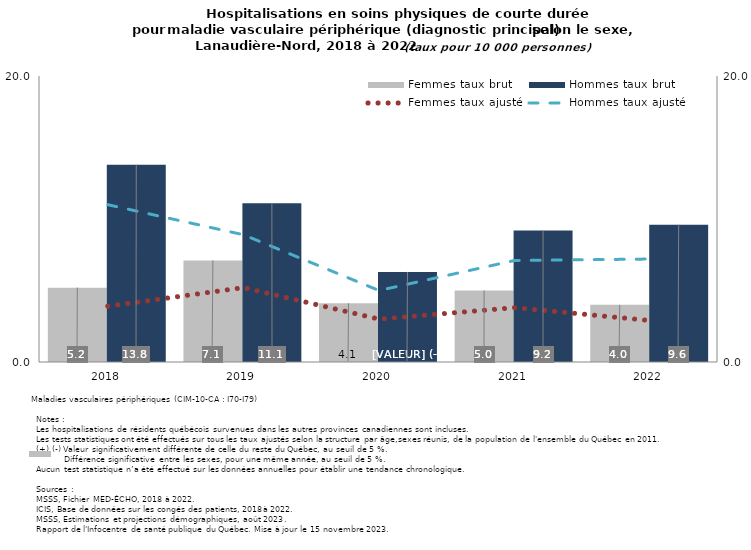
| Category | Femmes taux brut | Hommes taux brut |
|---|---|---|
| 2018.0 | 5.2 | 13.8 |
| 2019.0 | 7.1 | 11.1 |
| 2020.0 | 4.1 | 6.3 |
| 2021.0 | 5 | 9.2 |
| 2022.0 | 4 | 9.6 |